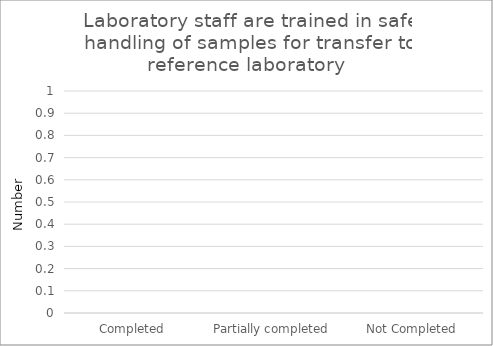
| Category | Laboratory staff are trained in safe handling of samples for transfer to reference laboratory  |
|---|---|
| Completed | 0 |
| Partially completed | 0 |
| Not Completed | 0 |